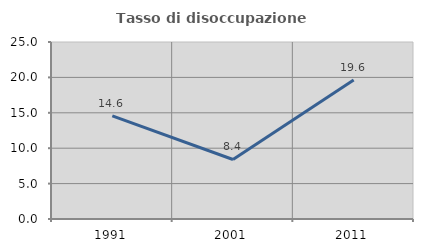
| Category | Tasso di disoccupazione giovanile  |
|---|---|
| 1991.0 | 14.557 |
| 2001.0 | 8.407 |
| 2011.0 | 19.619 |